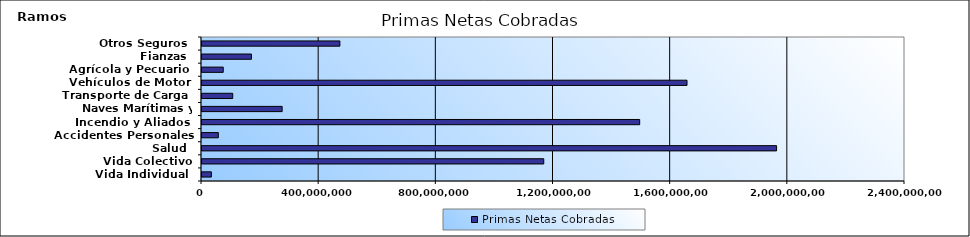
| Category | Primas Netas Cobradas |
|---|---|
| Vida Individual  | 32012741.04 |
| Vida Colectivo | 1166718862.15 |
| Salud  | 1961578435.78 |
| Accidentes Personales | 55824488.47 |
| Incendio y Aliados  | 1494199874.06 |
| Naves Marítimas y Aéreas  | 273608839.41 |
| Transporte de Carga  | 104890147.59 |
| Vehículos de Motor  | 1655822808.62 |
| Agrícola y Pecuario  | 72522520.38 |
| Fianzas  | 168926130.93 |
| Otros Seguros  | 470735342.55 |